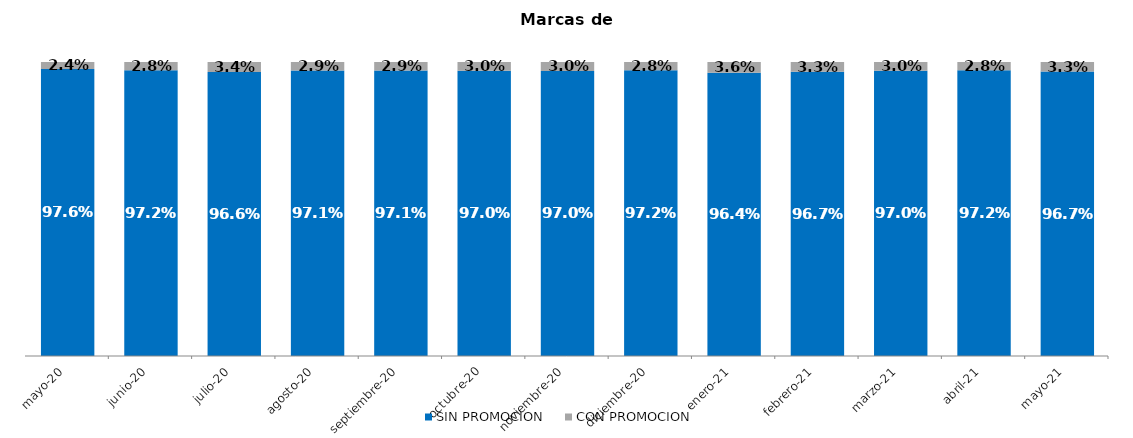
| Category | SIN PROMOCION   | CON PROMOCION   |
|---|---|---|
| 2020-05-01 | 0.976 | 0.024 |
| 2020-06-01 | 0.972 | 0.028 |
| 2020-07-01 | 0.966 | 0.034 |
| 2020-08-01 | 0.971 | 0.029 |
| 2020-09-01 | 0.971 | 0.029 |
| 2020-10-01 | 0.97 | 0.03 |
| 2020-11-01 | 0.97 | 0.03 |
| 2020-12-01 | 0.972 | 0.028 |
| 2021-01-01 | 0.964 | 0.036 |
| 2021-02-01 | 0.967 | 0.033 |
| 2021-03-01 | 0.97 | 0.03 |
| 2021-04-01 | 0.972 | 0.028 |
| 2021-05-01 | 0.967 | 0.033 |